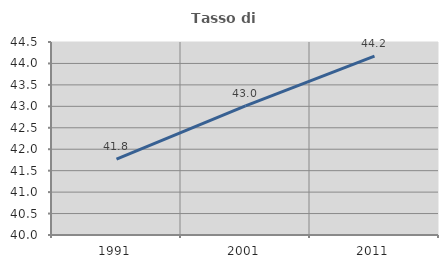
| Category | Tasso di occupazione   |
|---|---|
| 1991.0 | 41.77 |
| 2001.0 | 43.008 |
| 2011.0 | 44.172 |